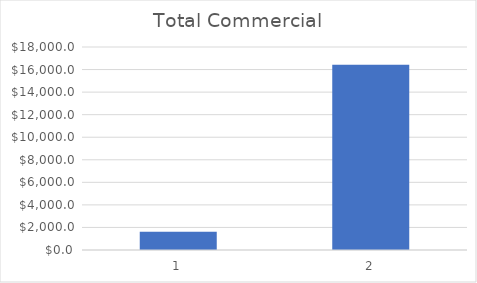
| Category | Total Commercial |
|---|---|
| 0 | 1610.557 |
| 1 | 16435.995 |